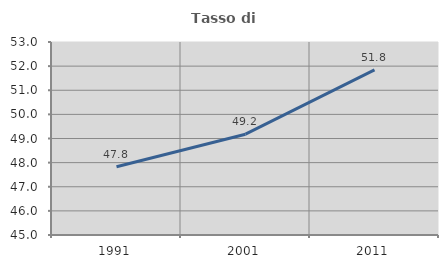
| Category | Tasso di occupazione   |
|---|---|
| 1991.0 | 47.831 |
| 2001.0 | 49.179 |
| 2011.0 | 51.845 |